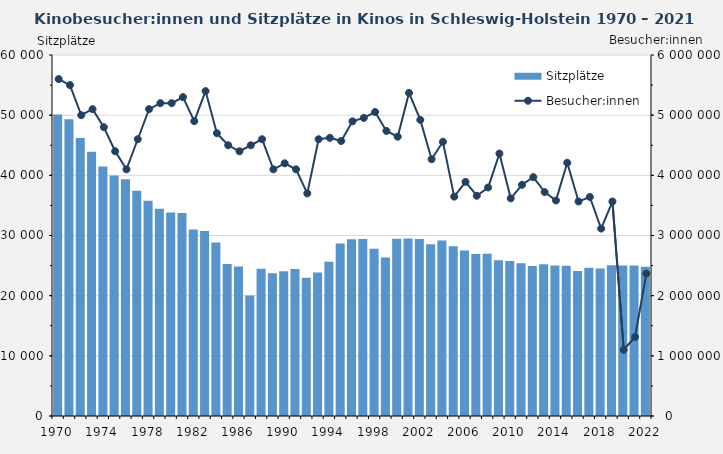
| Category | Sitzplätze |
|---|---|
| 1970.0 | 50131 |
| 1971.0 | 49340 |
| 1972.0 | 46218 |
| 1973.0 | 43920 |
| 1974.0 | 41476 |
| 1975.0 | 39984 |
| 1976.0 | 39356 |
| 1977.0 | 37439 |
| 1978.0 | 35790 |
| 1979.0 | 34452 |
| 1980.0 | 33811 |
| 1981.0 | 33753 |
| 1982.0 | 31007 |
| 1983.0 | 30746 |
| 1984.0 | 28841 |
| 1985.0 | 25277 |
| 1986.0 | 24832 |
| 1987.0 | 20012 |
| 1988.0 | 24488 |
| 1989.0 | 23738 |
| 1990.0 | 24053 |
| 1991.0 | 24435 |
| 1992.0 | 22976 |
| 1993.0 | 23830 |
| 1994.0 | 25626 |
| 1995.0 | 28679 |
| 1996.0 | 29392 |
| 1997.0 | 29428 |
| 1998.0 | 27782 |
| 1999.0 | 26345 |
| 2000.0 | 29453 |
| 2001.0 | 29522 |
| 2002.0 | 29407 |
| 2003.0 | 28564 |
| 2004.0 | 29184 |
| 2005.0 | 28231 |
| 2006.0 | 27493 |
| 2007.0 | 26941 |
| 2008.0 | 26959 |
| 2009.0 | 25887 |
| 2010.0 | 25769 |
| 2011.0 | 25402 |
| 2012.0 | 24920 |
| 2013.0 | 25234 |
| 2014.0 | 25012 |
| 2015.0 | 24979 |
| 2016.0 | 24110 |
| 2017.0 | 24656 |
| 2018.0 | 24507 |
| 2019.0 | 25048 |
| 2020.0 | 25018 |
| 2021.0 | 25018 |
| 2022.0 | 24824 |